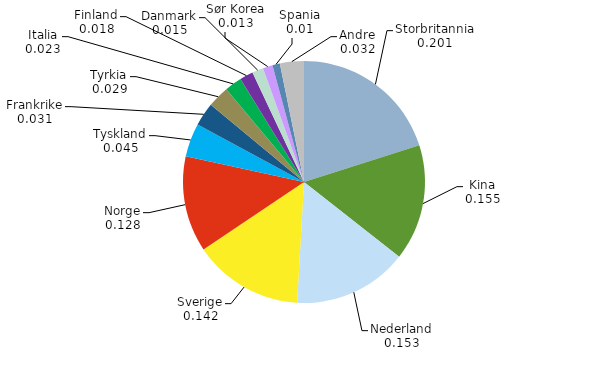
| Category | Series 0 |
|---|---|
| Storbritannia | 0.201 |
| Kina | 0.155 |
| Nederland | 0.153 |
| Sverige | 0.147 |
| Norge | 0.128 |
| Tyskland | 0.045 |
| Frankrike | 0.031 |
| Tyrkia | 0.029 |
| Italia | 0.023 |
| Finland | 0.018 |
| Danmark | 0.015 |
| Sør Korea | 0.013 |
| Spania | 0.01 |
| Andre | 0.032 |